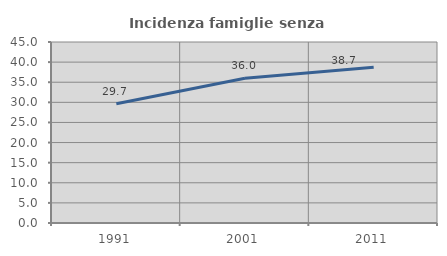
| Category | Incidenza famiglie senza nuclei |
|---|---|
| 1991.0 | 29.654 |
| 2001.0 | 35.978 |
| 2011.0 | 38.698 |